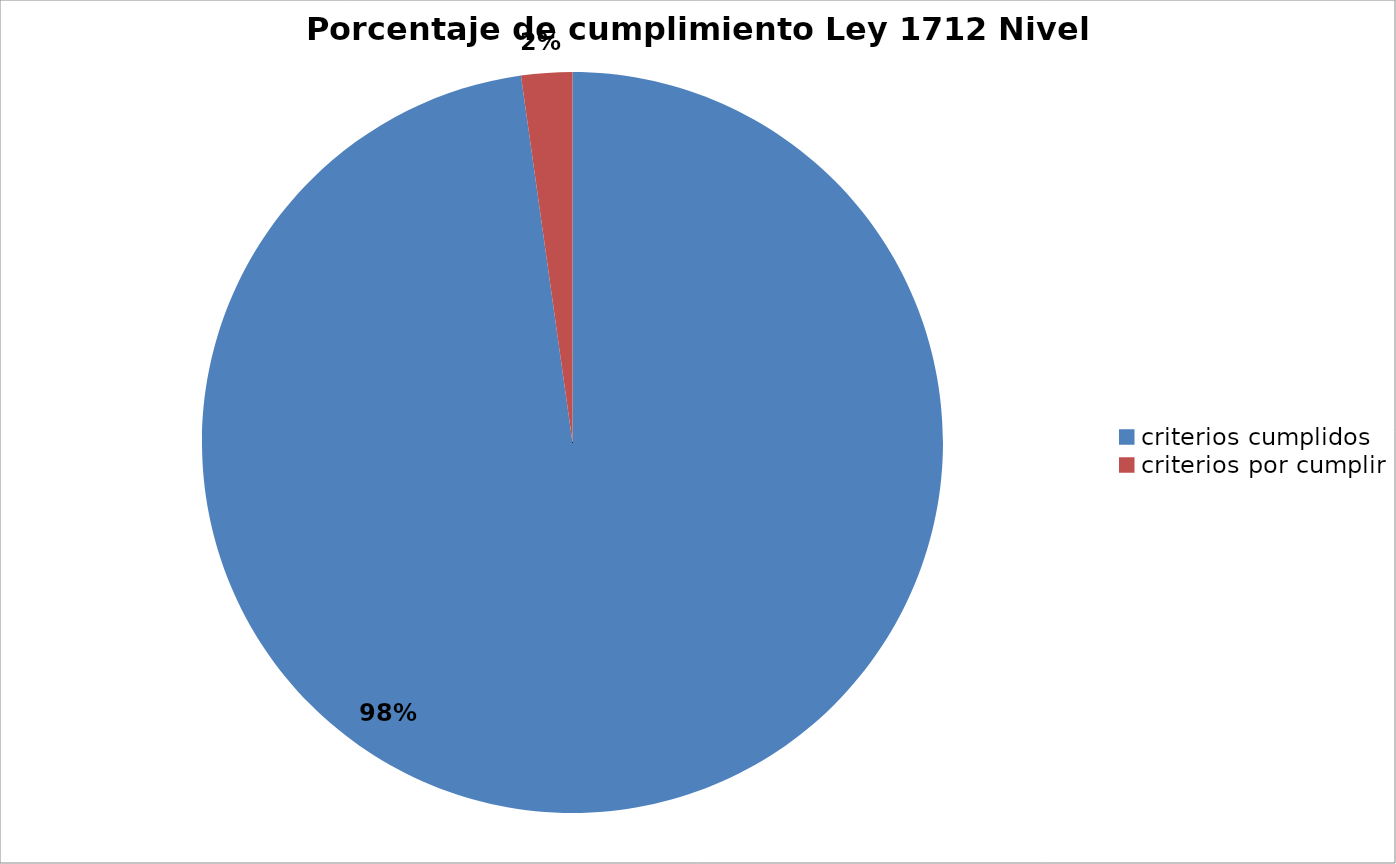
| Category | Series 0 |
|---|---|
| criterios cumplidos | 132 |
| criterios por cumplir | 3 |